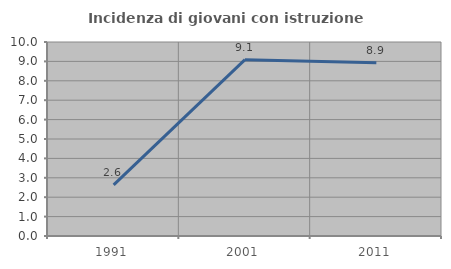
| Category | Incidenza di giovani con istruzione universitaria |
|---|---|
| 1991.0 | 2.632 |
| 2001.0 | 9.091 |
| 2011.0 | 8.929 |